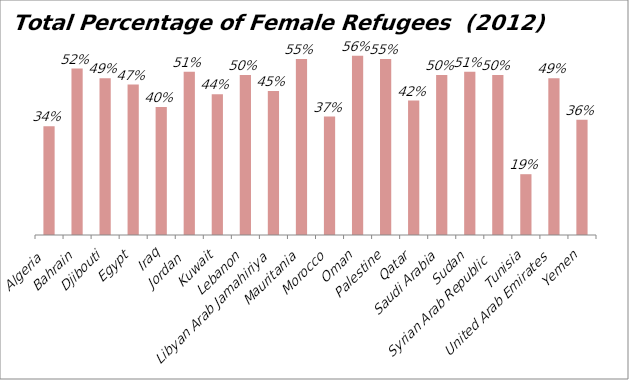
| Category | Total |
|---|---|
| Algeria  | 0.34 |
| Bahrain | 0.52 |
| Djibouti | 0.49 |
| Egypt | 0.47 |
| Iraq | 0.4 |
| Jordan  | 0.51 |
| Kuwait | 0.44 |
| Lebanon | 0.5 |
| Libyan Arab Jamahiriya | 0.45 |
| Mauritania | 0.55 |
| Morocco | 0.37 |
| Oman | 0.56 |
| Palestine | 0.55 |
| Qatar | 0.42 |
| Saudi Arabia | 0.5 |
| Sudan | 0.51 |
| Syrian Arab Republic  | 0.5 |
| Tunisia | 0.19 |
| United Arab Emirates | 0.49 |
| Yemen | 0.36 |